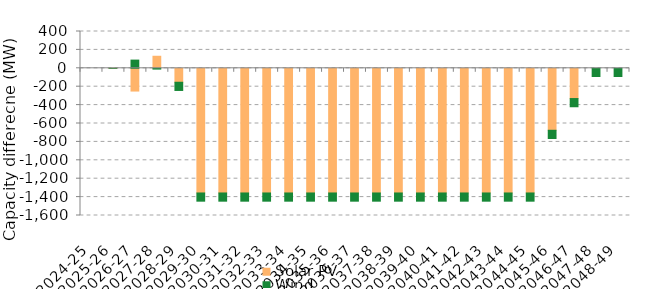
| Category | Solar PV | Wind | Offshore wind |
|---|---|---|---|
| 2024-25 | 0 | 0 | 0 |
| 2025-26 | 0 | 0 | 0 |
| 2026-27 | -247.368 | 89.143 | 0 |
| 2027-28 | 130.854 | -8.612 | 0 |
| 2028-29 | -151.695 | -89.225 | 0 |
| 2029-30 | -1355.087 | -89.225 | 0 |
| 2030-31 | -1355.088 | -89.225 | 0 |
| 2031-32 | -1355.088 | -89.225 | 0 |
| 2032-33 | -1355.088 | -89.225 | 0 |
| 2033-34 | -1355.088 | -89.225 | 0 |
| 2034-35 | -1355.088 | -89.225 | 0 |
| 2035-36 | -1355.088 | -89.225 | 0 |
| 2036-37 | -1355.088 | -89.225 | 0 |
| 2037-38 | -1355.088 | -89.225 | 0 |
| 2038-39 | -1355.088 | -89.225 | 0 |
| 2039-40 | -1355.087 | -89.225 | 0 |
| 2040-41 | -1355.087 | -89.225 | 0 |
| 2041-42 | -1355.087 | -89.225 | 0 |
| 2042-43 | -1355.087 | -89.225 | 0 |
| 2043-44 | -1355.087 | -89.225 | 0 |
| 2044-45 | -1355.087 | -89.225 | 0 |
| 2045-46 | -673.629 | -89.225 | 0 |
| 2046-47 | -328.757 | -89.225 | 0 |
| 2047-48 | 0 | -89.225 | 0 |
| 2048-49 | 0 | -89.225 | 0 |